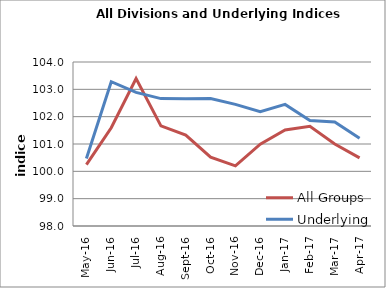
| Category | All Groups | Underlying |
|---|---|---|
| 2016-05-01 | 100.244 | 100.472 |
| 2016-06-01 | 101.595 | 103.278 |
| 2016-07-01 | 103.397 | 102.887 |
| 2016-08-01 | 101.664 | 102.661 |
| 2016-09-01 | 101.323 | 102.652 |
| 2016-10-01 | 100.517 | 102.66 |
| 2016-11-01 | 100.201 | 102.451 |
| 2016-12-01 | 100.991 | 102.18 |
| 2017-01-01 | 101.51 | 102.449 |
| 2017-02-01 | 101.644 | 101.858 |
| 2017-03-01 | 100.999 | 101.809 |
| 2017-04-01 | 100.493 | 101.209 |